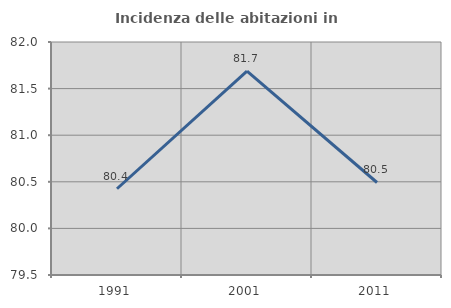
| Category | Incidenza delle abitazioni in proprietà  |
|---|---|
| 1991.0 | 80.425 |
| 2001.0 | 81.688 |
| 2011.0 | 80.493 |